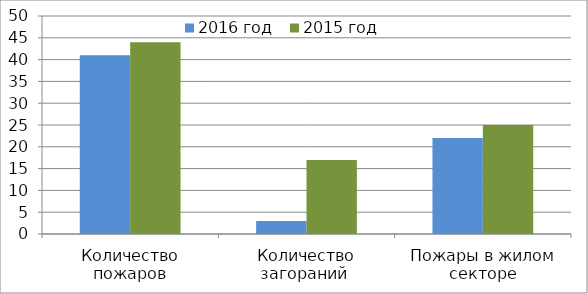
| Category | 2016 год | 2015 год |
|---|---|---|
| Количество пожаров | 41 | 44 |
| Количество загораний  | 3 | 17 |
| Пожары в жилом секторе | 22 | 25 |